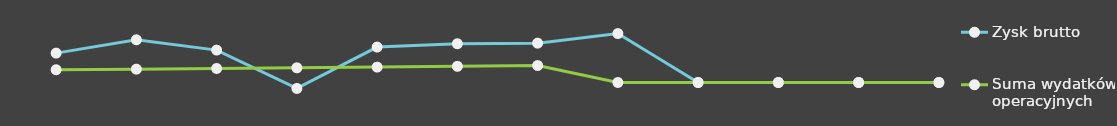
| Category | Zysk brutto | Suma wydatków operacyjnych |
|---|---|---|
| 0 | 25000 | 10841 |
| 1 | 36348 | 11367.25 |
| 2 | 27562 | 11919.82 |
| 3 | -5059.5 | 12500.01 |
| 4 | 30153.18 | 13109.21 |
| 5 | 32964.45 | 13748.86 |
| 6 | 33502.87 | 14420.51 |
| 7 | 41646 | 0 |
| 8 | 0 | 0 |
| 9 | 0 | 0 |
| 10 | 0 | 0 |
| 11 | 0 | 0 |